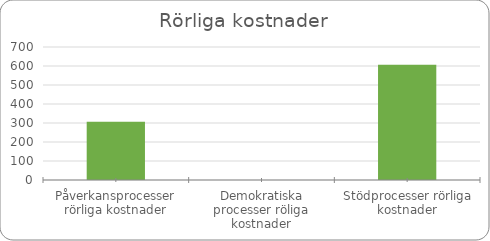
| Category | Series 0 |
|---|---|
| Påverkansprocesser rörliga kostnader | 306.5 |
| Demokratiska processer röliga kostnader | 0 |
| Stödprocesser rörliga kostnader | 607.2 |